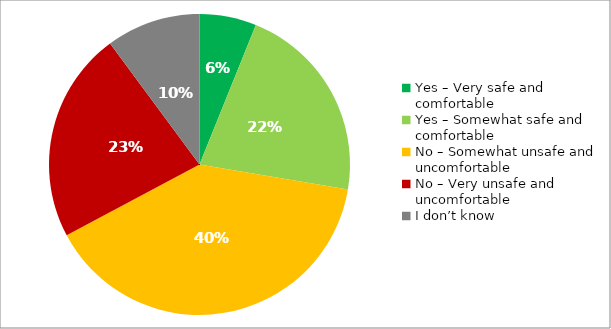
| Category | Responses |
|---|---|
| Yes – Very safe and comfortable | 0.061 |
| Yes – Somewhat safe and comfortable | 0.215 |
| No – Somewhat unsafe and uncomfortable | 0.395 |
| No – Very unsafe and uncomfortable | 0.227 |
| I don’t know | 0.101 |